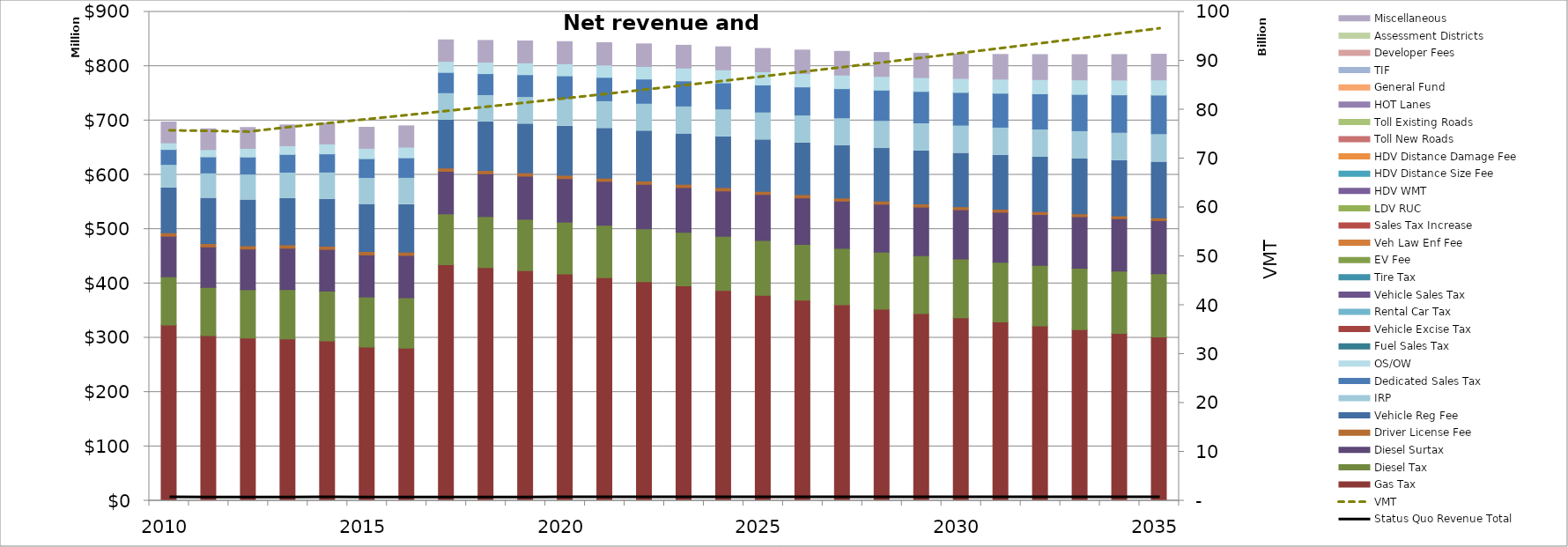
| Category | Gas Tax | Diesel Tax | Diesel Surtax | Driver License Fee | Vehicle Reg Fee | IRP | Dedicated Sales Tax | OS/OW | Fuel Sales Tax | Vehicle Excise Tax | Rental Car Tax | Vehicle Sales Tax | Tire Tax | EV Fee | Veh Law Enf Fee | Sales Tax Increase | LDV RUC | HDV WMT | HDV Distance Size Fee | HDV Distance Damage Fee | Toll New Roads | Toll Existing Roads | HOT Lanes | General Fund | TIF | Developer Fees | Assessment Districts | Miscellaneous |
|---|---|---|---|---|---|---|---|---|---|---|---|---|---|---|---|---|---|---|---|---|---|---|---|---|---|---|---|---|
| 2010.0 | 323316963.258 | 89037260.946 | 74668649.189 | 6397835.687 | 82551092.771 | 43277333.254 | 27511595.244 | 12190784.587 | 0 | 0 | 0 | 0 | 0 | 0 | 0 | 0 | 0 | 0 | 0 | 0 | 0 | 0 | 0 | 0 | 0 | 0 | 0 | 38400000 |
| 2011.0 | 303858725.302 | 88875276.333 | 74532467.624 | 6350108.819 | 83387848.595 | 46526761.624 | 29571250.187 | 13319815.864 | 0 | 0 | 0 | 0 | 0 | 0 | 0 | 0 | 0 | 0 | 0 | 0 | 0 | 0 | 0 | 0 | 0 | 0 | 0 | 38400000 |
| 2012.0 | 299617962.268 | 89057647.398 | 74680848.922 | 6224970.445 | 84180940.31 | 47642864.523 | 31433844.686 | 15913479.203 | 0 | 0 | 0 | 0 | 0 | 0 | 0 | 0 | 0 | 0 | 0 | 0 | 0 | 0 | 0 | 0 | 0 | 0 | 0 | 38400000 |
| 2013.0 | 298037157.415 | 90771330.029 | 76117629.141 | 6150319.83 | 85190669.781 | 48648740.114 | 32709513.838 | 15949340.683 | 0 | 0 | 0 | 0 | 0 | 0 | 0 | 0 | 0 | 0 | 0 | 0 | 0 | 0 | 0 | 0 | 0 | 0 | 0 | 38400000 |
| 2014.0 | 294433591.413 | 91504818.056 | 76734847.016 | 6128459.29 | 86048423.685 | 50293371.077 | 33514569.93 | 18140894.882 | 0 | 0 | 0 | 0 | 0 | 0 | 0 | 0 | 0 | 0 | 0 | 0 | 0 | 0 | 0 | 0 | 0 | 0 | 0 | 38400000 |
| 2015.0 | 283015760.15 | 92214265.278 | 77330111.805 | 6169471.962 | 86799065.999 | 49573166.946 | 34709004.589 | 18999667.964 | 0 | 0 | 0 | 0 | 0 | 0 | 0 | 0 | 0 | 0 | 0 | 0 | 0 | 0 | 0 | 0 | 0 | 0 | 0 | 38784000 |
| 2016.0 | 280769432.222 | 92955846.961 | 77952256.74 | 6149330.457 | 87555283.346 | 49912999.566 | 36090353.72 | 19643400.262 | 0 | 0 | 0 | 0 | 0 | 0 | 0 | 0 | 0 | 0 | 0 | 0 | 0 | 0 | 0 | 0 | 0 | 0 | 0 | 39171840 |
| 2017.0 | 434758967.787 | 93385179.857 | 78312593.155 | 6127263.396 | 88315941.976 | 50292704.819 | 37382699.744 | 20392813.69 | 0 | 0 | 0 | 0 | 0 | 0 | 0 | 0 | 0 | 0 | 0 | 0 | 0 | 0 | 0 | 0 | 0 | 0 | 0 | 39563558.4 |
| 2018.0 | 429267476.335 | 93915597.836 | 78757711.685 | 6103202.772 | 89079433.031 | 50489063.416 | 38728843.846 | 21111475.711 | 0 | 0 | 0 | 0 | 0 | 0 | 0 | 0 | 0 | 0 | 0 | 0 | 0 | 0 | 0 | 0 | 0 | 0 | 0 | 39959193.984 |
| 2019.0 | 423571674.549 | 94655381.899 | 79378395.188 | 6077078.406 | 89847456.534 | 50661425.312 | 40200049.541 | 21698527.98 | 0 | 0 | 0 | 0 | 0 | 0 | 0 | 0 | 0 | 0 | 0 | 0 | 0 | 0 | 0 | 0 | 0 | 0 | 0 | 40358785.924 |
| 2020.0 | 417553880.205 | 95480325.028 | 80070497.098 | 6048817.879 | 90619612.356 | 50814454.837 | 41662707.538 | 22231347.902 | 0 | 0 | 0 | 0 | 0 | 0 | 0 | 0 | 0 | 0 | 0 | 0 | 0 | 0 | 0 | 0 | 0 | 0 | 0 | 40762373.783 |
| 2021.0 | 410815279.718 | 96390574.296 | 80834140.97 | 6017254.71 | 91395485.982 | 50951853.779 | 43083589.138 | 22713183.531 | 0 | 0 | 0 | 0 | 0 | 0 | 0 | 0 | 0 | 0 | 0 | 0 | 0 | 0 | 0 | 0 | 0 | 0 | 0 | 41169997.521 |
| 2022.0 | 403443890.073 | 97401246.421 | 81682001.742 | 5983415.28 | 92174479.475 | 51076454.888 | 44592469.456 | 23153462.211 | 0 | 0 | 0 | 0 | 0 | 0 | 0 | 0 | 0 | 0 | 0 | 0 | 0 | 0 | 0 | 0 | 0 | 0 | 0 | 41581697.496 |
| 2023.0 | 395522462.035 | 98521198.567 | 82621506.083 | 5947221.291 | 92956552.571 | 51190400.352 | 46248088.312 | 23558624.284 | 0 | 0 | 0 | 0 | 0 | 0 | 0 | 0 | 0 | 0 | 0 | 0 | 0 | 0 | 0 | 0 | 0 | 0 | 0 | 41997514.471 |
| 2024.0 | 387051003.356 | 99736955.539 | 83641355.679 | 5908591.969 | 93741074.821 | 51295247.888 | 47985815.533 | 23933756.999 | 0 | 0 | 0 | 0 | 0 | 0 | 0 | 0 | 0 | 0 | 0 | 0 | 0 | 0 | 0 | 0 | 0 | 0 | 0 | 42417489.616 |
| 2025.0 | 378156256.36 | 101025618.981 | 84722351.17 | 5867443.988 | 94527379.76 | 51392164.933 | 49789653.808 | 24282881.883 | 0 | 0 | 0 | 0 | 0 | 0 | 0 | 0 | 0 | 0 | 0 | 0 | 0 | 0 | 0 | 0 | 0 | 0 | 0 | 42841664.512 |
| 2026.0 | 369356972.409 | 102365025.32 | 85845909.291 | 5822705.551 | 95315038.733 | 51482070.481 | 51694866.129 | 24609247.881 | 0 | 0 | 0 | 0 | 0 | 0 | 0 | 0 | 0 | 0 | 0 | 0 | 0 | 0 | 0 | 0 | 0 | 0 | 0 | 43270081.157 |
| 2027.0 | 360811809.96 | 103750728.387 | 87008302.355 | 5775289.322 | 96104110.237 | 51565790.308 | 53709994.728 | 24915558.76 | 0 | 0 | 0 | 0 | 0 | 0 | 0 | 0 | 0 | 0 | 0 | 0 | 0 | 0 | 0 | 0 | 0 | 0 | 0 | 43702781.969 |
| 2028.0 | 352527923.628 | 105184572.625 | 88211077.217 | 5725105.223 | 96894207.453 | 51644038.968 | 55753731.104 | 25204077.512 | 0 | 0 | 0 | 0 | 0 | 0 | 0 | 0 | 0 | 0 | 0 | 0 | 0 | 0 | 0 | 0 | 0 | 0 | 0 | 44139809.788 |
| 2029.0 | 344510121.665 | 106659948.317 | 89448692.164 | 5672060.35 | 97685617.957 | 51717369.552 | 57885614.942 | 25476683.746 | 0 | 0 | 0 | 0 | 0 | 0 | 0 | 0 | 0 | 0 | 0 | 0 | 0 | 0 | 0 | 0 | 0 | 0 | 0 | 44581207.886 |
| 2030.0 | 336756480.719 | 108195980.666 | 90737183.584 | 5616058.892 | 98478586.304 | 51786388.002 | 60140097.706 | 25735040.063 | 0 | 0 | 0 | 0 | 0 | 0 | 0 | 0 | 0 | 0 | 0 | 0 | 0 | 0 | 0 | 0 | 0 | 0 | 0 | 45027019.965 |
| 2031.0 | 329268774.146 | 109780896.565 | 92066680.445 | 5556435.22 | 99272573.525 | 51851454.471 | 62442312.109 | 25980491.789 | 0 | 0 | 0 | 0 | 0 | 0 | 0 | 0 | 0 | 0 | 0 | 0 | 0 | 0 | 0 | 0 | 0 | 0 | 0 | 45477290.165 |
| 2032.0 | 322044654.841 | 111414028.3 | 93436623.318 | 5493666.699 | 100068121.167 | 51912931.167 | 64870620.566 | 26214224.291 | 0 | 0 | 0 | 0 | 0 | 0 | 0 | 0 | 0 | 0 | 0 | 0 | 0 | 0 | 0 | 0 | 0 | 0 | 0 | 45932063.066 |
| 2033.0 | 315013117.827 | 113084342.133 | 94837739.574 | 5427649.217 | 100864895.594 | 52005851.078 | 66867948.952 | 26756364.074 | 0 | 0 | 0 | 0 | 0 | 0 | 0 | 0 | 0 | 0 | 0 | 0 | 0 | 0 | 0 | 0 | 0 | 0 | 0 | 46391383.697 |
| 2034.0 | 308164150.25 | 114809211.98 | 96284616.634 | 5358275.417 | 101663533.875 | 52099003.486 | 68926773.907 | 27309750.61 | 0 | 0 | 0 | 0 | 0 | 0 | 0 | 0 | 0 | 0 | 0 | 0 | 0 | 0 | 0 | 0 | 0 | 0 | 0 | 46855297.534 |
| 2035.0 | 301497586.811 | 116584771.397 | 97774013.048 | 5285434.597 | 102463995.526 | 52192363.898 | 71048988.877 | 27874604.5 | 0 | 0 | 0 | 0 | 0 | 0 | 0 | 0 | 0 | 0 | 0 | 0 | 0 | 0 | 0 | 0 | 0 | 0 | 0 | 47323850.509 |